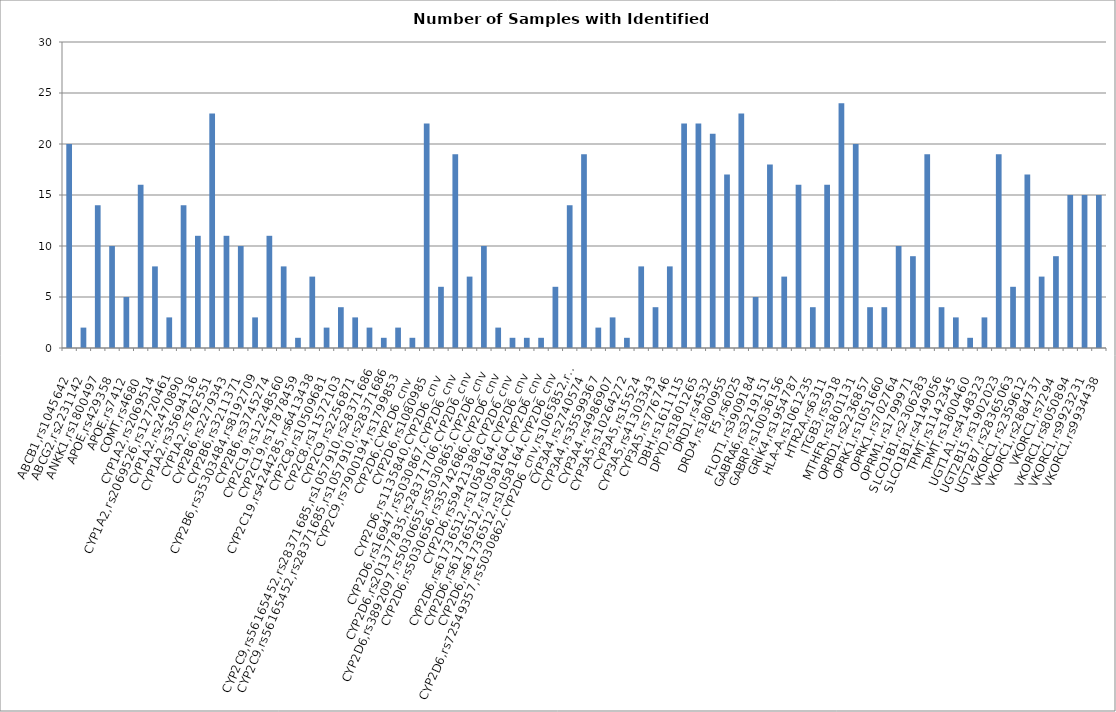
| Category | Number of samples with SNP |
|---|---|
| ABCB1,rs1045642 | 20 |
| ABCG2,rs2231142 | 2 |
| ANKK1,rs1800497 | 14 |
| APOE,rs429358 | 10 |
| APOE,rs7412 | 5 |
| COMT,rs4680 | 16 |
| CYP1A2,rs2069514 | 8 |
| CYP1A2,rs2069526,rs12720461 | 3 |
| CYP1A2,rs2470890 | 14 |
| CYP1A2,rs35694136 | 11 |
| CYP1A2,rs762551 | 23 |
| CYP2B6,rs2279343 | 11 |
| CYP2B6,rs3211371 | 10 |
| CYP2B6,rs35303484,rs8192709 | 3 |
| CYP2B6,rs3745274 | 11 |
| CYP2C19,rs12248560 | 8 |
| CYP2C19,rs17878459 | 1 |
| CYP2C19,rs4244285,rs6413438 | 7 |
| CYP2C8,rs10509681 | 2 |
| CYP2C8,rs11572103 | 4 |
| CYP2C9,rs2256871 | 3 |
| CYP2C9,rs56165452,rs28371685,rs1057910,rs28371686 | 2 |
| CYP2C9,rs56165452,rs28371685,rs1057910,rs28371686 | 1 |
| CYP2C9,rs7900194,rs1799853 | 2 |
| CYP2D6,CYP2D6_cnv | 1 |
| CYP2D6,rs1080985 | 22 |
| CYP2D6,rs1135840,CYP2D6_cnv | 6 |
| CYP2D6,rs16947,rs5030867,CYP2D6_cnv | 19 |
| CYP2D6,rs201377835,rs28371706,CYP2D6_cnv | 7 |
| CYP2D6,rs3892097,rs5030655,rs5030865,CYP2D6_cnv | 10 |
| CYP2D6,rs5030656,rs35742686,CYP2D6_cnv | 2 |
| CYP2D6,rs59421388,CYP2D6_cnv | 1 |
| CYP2D6,rs61736512,rs1058164,CYP2D6_cnv | 1 |
| CYP2D6,rs61736512,rs1058164,CYP2D6_cnv | 1 |
| CYP2D6,rs61736512,rs1058164,CYP2D6_cnv | 6 |
| CYP2D6,rs72549357,rs5030862,CYP2D6_cnv,rs1065852,rs769258 | 14 |
| CYP3A4,rs2740574 | 19 |
| CYP3A4,rs35599367 | 2 |
| CYP3A4,rs4986907 | 3 |
| CYP3A5,rs10264272 | 1 |
| CYP3A5,rs15524 | 8 |
| CYP3A5,rs41303343 | 4 |
| CYP3A5,rs776746 | 8 |
| DBH,rs1611115 | 22 |
| DPYD,rs1801265 | 22 |
| DRD1,rs4532 | 21 |
| DRD4,rs1800955 | 17 |
| F5,rs6025 | 23 |
| FLOT1,rs3909184 | 5 |
| GABRA6,rs3219151 | 18 |
| GABRP,rs10036156 | 7 |
| GRIK4,rs1954787 | 16 |
| HLA-A,rs1061235 | 4 |
| HTR2A,rs6311 | 16 |
| ITGB3,rs5918 | 24 |
| MTHFR,rs1801131 | 20 |
| OPRD1,rs2236857 | 4 |
| OPRK1,rs1051660 | 4 |
| OPRK1,rs702764 | 10 |
| OPRM1,rs1799971 | 9 |
| SLCO1B1,rs2306283 | 19 |
| SLCO1B1,rs4149056 | 4 |
| TPMT,rs1142345 | 3 |
| TPMT,rs1800460 | 1 |
| UGT1A1,rs4148323 | 3 |
| UGT2B15,rs1902023 | 19 |
| UGT2B7,rs28365063 | 6 |
| VKORC1,rs2359612 | 17 |
| VKORC1,rs2884737 | 7 |
| VKORC1,rs7294 | 9 |
| VKORC1,rs8050894 | 15 |
| VKORC1,rs9923231 | 15 |
| VKORC1,rs9934438 | 15 |